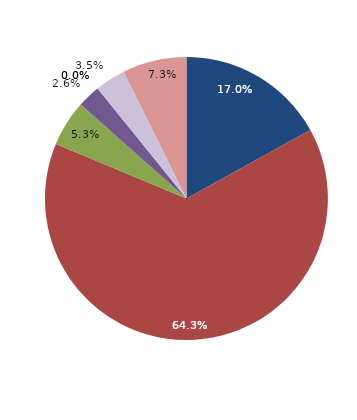
| Category | Series 0 |
|---|---|
| قبل الدخول
Before Consummation | 16.959 |
| -1 | 64.327 |
| 1 | 5.263 |
| 2 | 2.632 |
| 3 | 0 |
| 4 | 0 |
|  5 - 9 | 3.509 |
| 10+ | 7.31 |